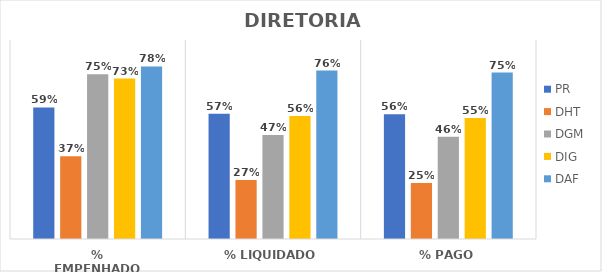
| Category | PR | DHT | DGM | DIG | DAF |
|---|---|---|---|---|---|
| % EMPENHADO | 0.595 | 0.375 | 0.745 | 0.726 | 0.78 |
| % LIQUIDADO | 0.567 | 0.266 | 0.471 | 0.556 | 0.762 |
| % PAGO | 0.564 | 0.253 | 0.462 | 0.548 | 0.753 |